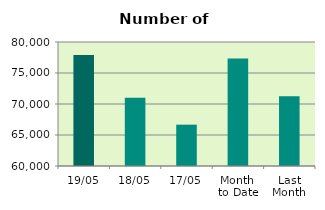
| Category | Series 0 |
|---|---|
| 19/05 | 77896 |
| 18/05 | 71008 |
| 17/05 | 66666 |
| Month 
to Date | 77328.667 |
| Last
Month | 71251.4 |